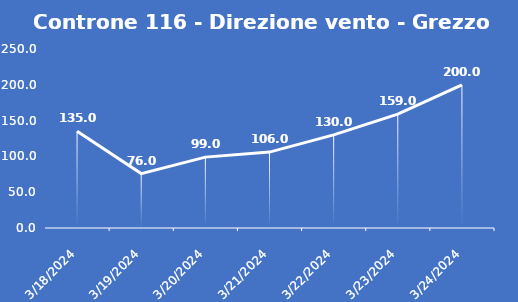
| Category | Controne 116 - Direzione vento - Grezzo (°N) |
|---|---|
| 3/18/24 | 135 |
| 3/19/24 | 76 |
| 3/20/24 | 99 |
| 3/21/24 | 106 |
| 3/22/24 | 130 |
| 3/23/24 | 159 |
| 3/24/24 | 200 |